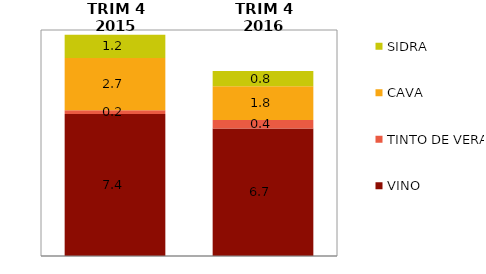
| Category | VINO | TINTO DE VERANO | CAVA | SIDRA |
|---|---|---|---|---|
| TRIM 4 2015 | 7.409 | 0.198 | 2.736 | 1.206 |
| TRIM 4 2016 | 6.66 | 0.446 | 1.752 | 0.803 |